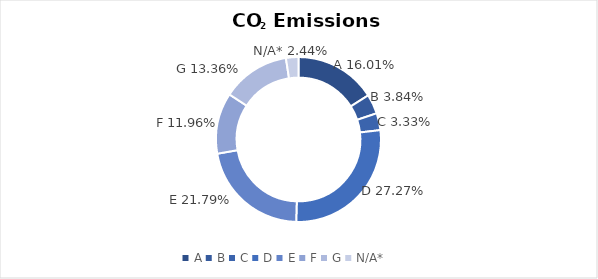
| Category | Series 0 |
|---|---|
| A | 0.16 |
| B | 0.038 |
| C | 0.033 |
| D | 0.273 |
| E | 0.218 |
| F | 0.12 |
| G | 0.134 |
| N/A* | 0.024 |